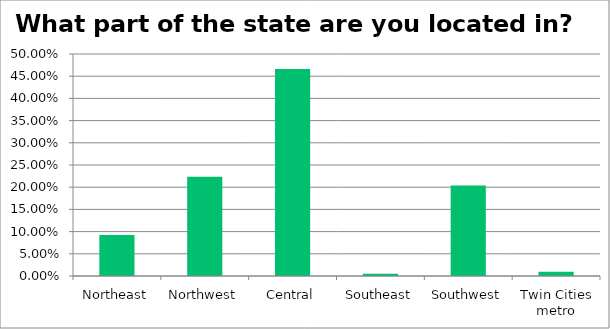
| Category | Responses |
|---|---|
| Northeast | 0.092 |
| Northwest | 0.223 |
| Central | 0.466 |
| Southeast | 0.005 |
| Southwest | 0.204 |
| Twin Cities metro | 0.01 |